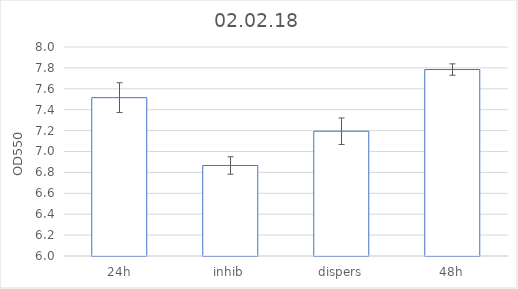
| Category | Series 0 |
|---|---|
| 24h | 7.515 |
| inhib | 6.866 |
| dispers | 7.194 |
| 48h | 7.784 |